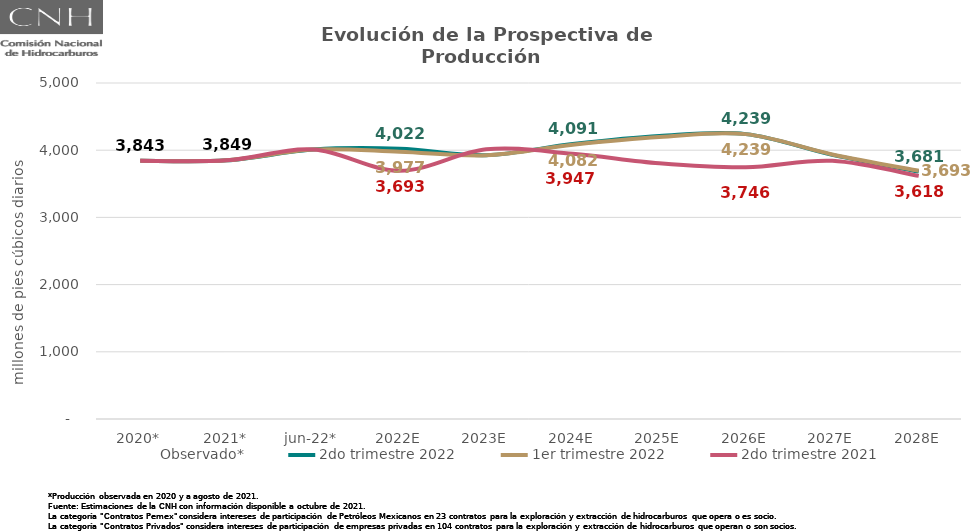
| Category | Observado* | 2do trimestre 2022 | 1er trimestre 2022 | 2do trimestre 2021 |
|---|---|---|---|---|
| 2020* | 3843.295 | 3843.295 | 3843.295 | 3843.295 |
| 2021* | 3849.2 | 3849.2 | 3849.2 | 3849.2 |
| jun-22* | 4009.858 | 4009.858 | 4009.858 | 4009.858 |
| 2022E | 4021.769 | 4021.769 | 3976.936 | 3693.191 |
| 2023E | 3925.953 | 3925.953 | 3923.539 | 4013.195 |
| 2024E | 4091.168 | 4091.168 | 4081.643 | 3947.245 |
| 2025E | 4210.236 | 4210.236 | 4196.961 | 3804.566 |
| 2026E | 4239.197 | 4239.197 | 4239.087 | 3746.309 |
| 2027E | 3931.086 | 3931.086 | 3937.149 | 3842.419 |
| 2028E | 3681.179 | 3681.179 | 3693.161 | 3617.835 |